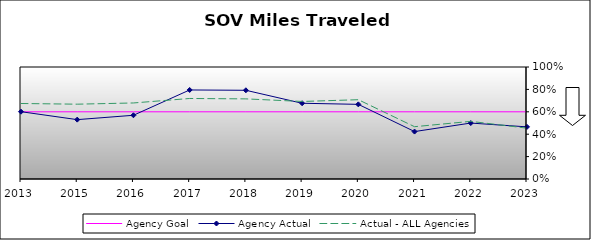
| Category | Agency Goal | Agency Actual | Actual - ALL Agencies |
|---|---|---|---|
| 2013.0 | 0.6 | 0.601 | 0.674 |
| 2015.0 | 0.6 | 0.53 | 0.668 |
| 2016.0 | 0.6 | 0.569 | 0.679 |
| 2017.0 | 0.6 | 0.795 | 0.719 |
| 2018.0 | 0.6 | 0.792 | 0.715 |
| 2019.0 | 0.6 | 0.676 | 0.692 |
| 2020.0 | 0.6 | 0.666 | 0.708 |
| 2021.0 | 0.6 | 0.424 | 0.467 |
| 2022.0 | 0.6 | 0.5 | 0.515 |
| 2023.0 | 0.6 | 0.465 | 0.454 |